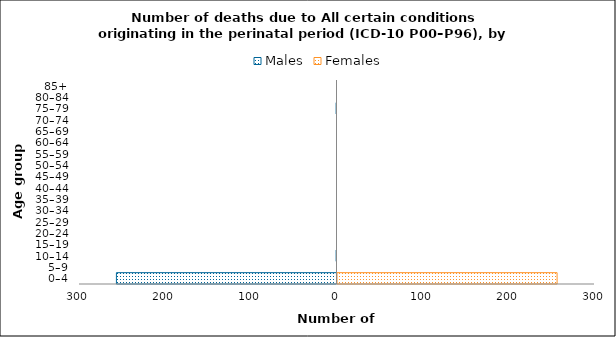
| Category | Males | Females |
|---|---|---|
| 0–4 | -257 | 257 |
| 5–9 | 0 | 0 |
| 10–14 | -1 | 0 |
| 15–19 | 0 | 0 |
| 20–24 | 0 | 0 |
| 25–29 | 0 | 0 |
| 30–34 | 0 | 0 |
| 35–39 | 0 | 0 |
| 40–44 | 0 | 0 |
| 45–49 | 0 | 0 |
| 50–54 | 0 | 0 |
| 55–59 | 0 | 0 |
| 60–64 | 0 | 0 |
| 65–69 | 0 | 0 |
| 70–74 | 0 | 0 |
| 75–79 | -1 | 0 |
| 80–84 | 0 | 0 |
| 85+ | 0 | 0 |